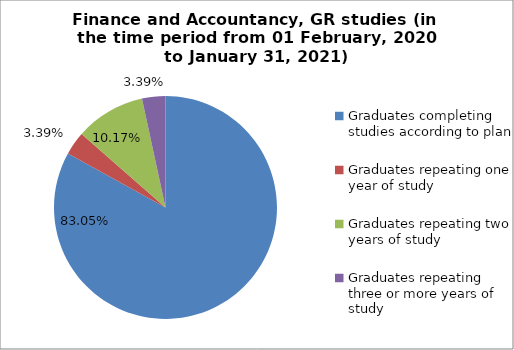
| Category | Series 0 |
|---|---|
| Graduates completing studies according to plan | 83.051 |
| Graduates repeating one year of study | 3.39 |
| Graduates repeating two years of study | 10.169 |
| Graduates repeating three or more years of study | 3.39 |